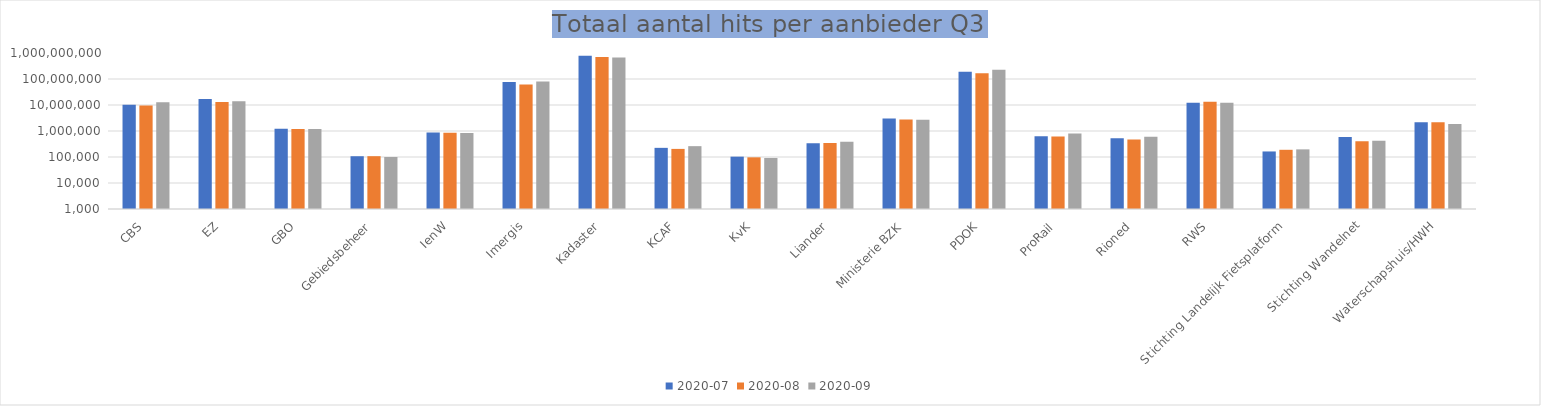
| Category | 2020-07 | 2020-08 | 2020-09 |
|---|---|---|---|
| CBS | 10147372 | 9549849 | 12645573 |
| EZ | 17127694 | 12974118 | 14044604 |
| GBO | 1219187 | 1186389 | 1200651 |
| Gebiedsbeheer | 107084 | 107544 | 100255 |
| IenW | 885329 | 864865 | 833101 |
| Imergis | 76815456 | 61420299 | 79274845 |
| Kadaster | 791391197 | 702599909 | 666241428 |
| KCAF | 224778 | 204883 | 261157 |
| KvK | 103181 | 97111 | 91790 |
| Liander | 340720 | 342333 | 382222 |
| Ministerie BZK | 3020151 | 2799531 | 2684487 |
| PDOK | 191522289 | 165685988 | 224757014 |
| ProRail | 621967 | 620232 | 804891 |
| Rioned | 524340 | 475852 | 600506 |
| RWS | 12180711 | 13477119 | 12270673 |
| Stichting Landelijk Fietsplatform | 163298 | 189223 | 196649 |
| Stichting Wandelnet | 585749 | 404418 | 419648 |
| Waterschapshuis/HWH | 2169016 | 2167442 | 1853900 |